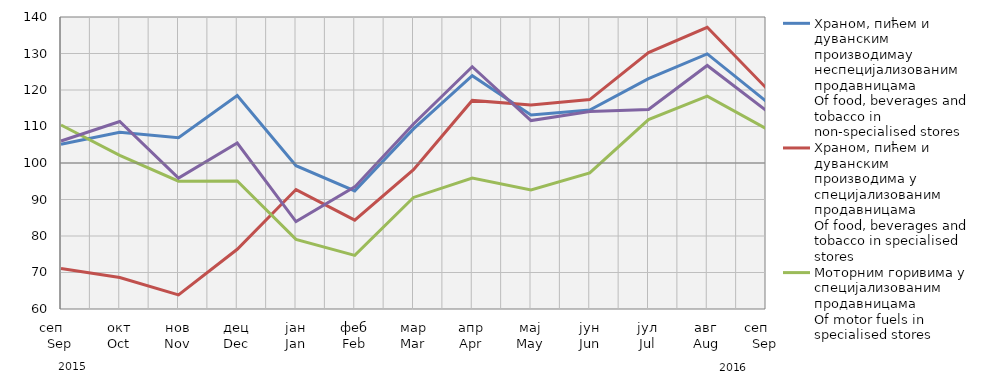
| Category | Храном, пићем и дуванским производимау неспецијализованим продавницама
Of food, beverages and tobacco in non-specialised stores
 | Храном, пићем и дуванским производима у специјализовaним продавницама
Of food, beverages and tobacco in specialised stores | Моторним горивима у специјализованим продавницама
Of motor fuels in specialised stores | Остала
Other |
|---|---|---|---|---|
| сеп     Sep | 105.123 | 71.088 | 110.411 | 106.02 |
| окт
Oct | 108.393 | 68.621 | 102.068 | 111.365 |
| нов
Nov | 106.938 | 63.847 | 95.032 | 95.869 |
| дец
Dec | 118.498 | 76.368 | 95.084 | 105.475 |
| јан
Jan | 99.255 | 92.722 | 79.068 | 83.94 |
| феб
Feb | 92.363 | 84.339 | 74.7 | 93.451 |
| мар
Mar | 109.349 | 98.183 | 90.564 | 110.695 |
| апр
Apr | 123.935 | 117.147 | 95.897 | 126.373 |
| мај
May | 113.15 | 115.884 | 92.592 | 111.621 |
| јун
Jun | 114.503 | 117.373 | 97.274 | 114.134 |
| јул
Jul | 123.119 | 130.235 | 111.897 | 114.647 |
| авг
Aug | 129.897 | 137.173 | 118.321 | 126.728 |
| сеп     Sep | 116.954 | 120.599 | 109.459 | 114.395 |